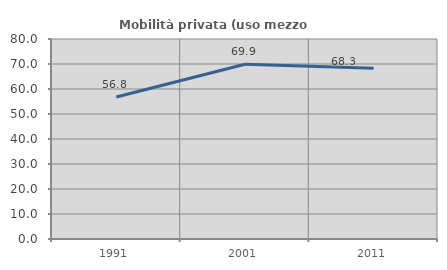
| Category | Mobilità privata (uso mezzo privato) |
|---|---|
| 1991.0 | 56.831 |
| 2001.0 | 69.882 |
| 2011.0 | 68.332 |